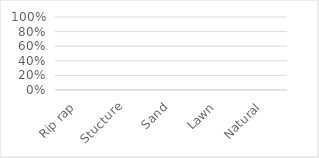
| Category | Series 0 |
|---|---|
| Rip rap | 0 |
| Stucture | 0 |
| Sand | 0 |
| Lawn | 0 |
| Natural | 0 |